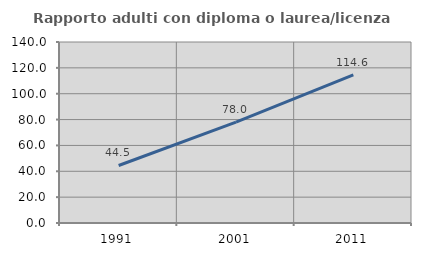
| Category | Rapporto adulti con diploma o laurea/licenza media  |
|---|---|
| 1991.0 | 44.486 |
| 2001.0 | 78.004 |
| 2011.0 | 114.559 |